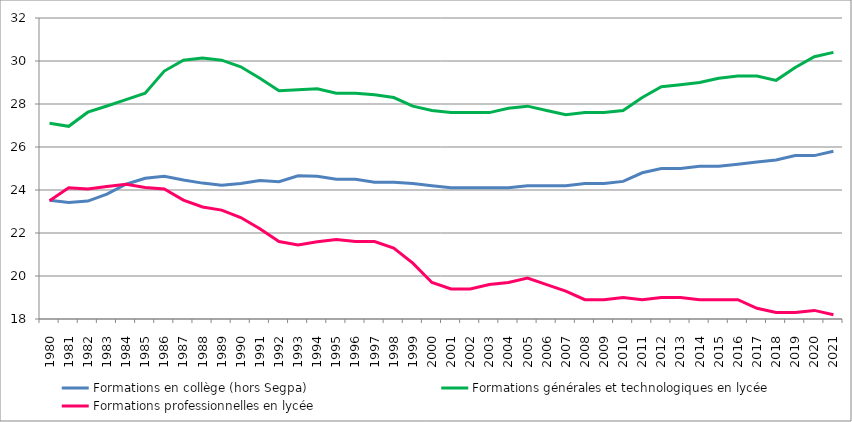
| Category | Formations en collège (hors Segpa) | Formations générales et technologiques en lycée | Formations professionnelles en lycée |
|---|---|---|---|
| 1980 | 23.523 | 27.1 | 23.5 |
| 1981 | 23.423 | 26.961 | 24.099 |
| 1982 | 23.485 | 27.62 | 24.043 |
| 1983 | 23.805 | 27.908 | 24.165 |
| 1984 | 24.267 | 28.202 | 24.266 |
| 1985 | 24.546 | 28.5 | 24.121 |
| 1986 | 24.644 | 29.532 | 24.044 |
| 1987 | 24.462 | 30.038 | 23.532 |
| 1988 | 24.321 | 30.138 | 23.21 |
| 1989 | 24.221 | 30.038 | 23.066 |
| 1990 | 24.3 | 29.732 | 22.721 |
| 1991 | 24.441 | 29.196 | 22.199 |
| 1992 | 24.382 | 28.62 | 21.6 |
| 1993 | 24.662 | 28.667 | 21.444 |
| 1994 | 24.641 | 28.708 | 21.589 |
| 1995 | 24.5 | 28.5 | 21.7 |
| 1996 | 24.5 | 28.5 | 21.6 |
| 1997 | 24.362 | 28.431 | 21.6 |
| 1998 | 24.362 | 28.3 | 21.3 |
| 1999 | 24.3 | 27.9 | 20.6 |
| 2000 | 24.2 | 27.7 | 19.7 |
| 2001 | 24.1 | 27.6 | 19.4 |
| 2002 | 24.1 | 27.6 | 19.4 |
| 2003 | 24.1 | 27.6 | 19.6 |
| 2004 | 24.1 | 27.8 | 19.7 |
| 2005 | 24.2 | 27.9 | 19.9 |
| 2006 | 24.2 | 27.7 | 19.6 |
| 2007 | 24.2 | 27.5 | 19.3 |
| 2008 | 24.3 | 27.6 | 18.9 |
| 2009 | 24.3 | 27.6 | 18.9 |
| 2010 | 24.4 | 27.7 | 19 |
| 2011 | 24.8 | 28.3 | 18.9 |
| 2012 | 25 | 28.8 | 19 |
| 2013 | 25 | 28.9 | 19 |
| 2014 | 25.1 | 29 | 18.9 |
| 2015 | 25.1 | 29.2 | 18.9 |
| 2016 | 25.2 | 29.3 | 18.9 |
| 2017 | 25.3 | 29.3 | 18.5 |
| 2018 | 25.4 | 29.1 | 18.3 |
| 2019 | 25.6 | 29.7 | 18.3 |
| 2020 | 25.6 | 30.2 | 18.4 |
| 2021 | 25.8 | 30.4 | 18.2 |